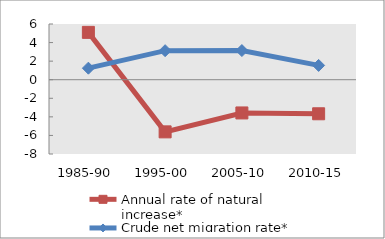
| Category | Annual rate of natural increase* | Crude net migration rate* |
|---|---|---|
| 1985-90 | 5.099 | 1.243 |
| 1995-00 | -5.616 | 3.126 |
| 2005-10 | -3.579 | 3.14 |
| 2010-15 | -3.668 | 1.54 |